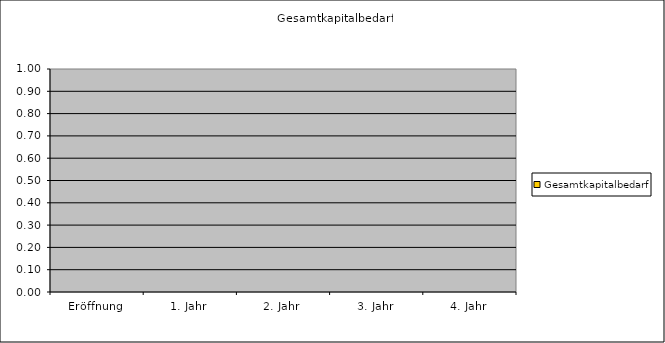
| Category | Gesamtkapitalbedarf |
|---|---|
| Eröffnung | 0 |
| 1. Jahr | 0 |
| 2. Jahr | 0 |
| 3. Jahr | 0 |
| 4. Jahr | 0 |